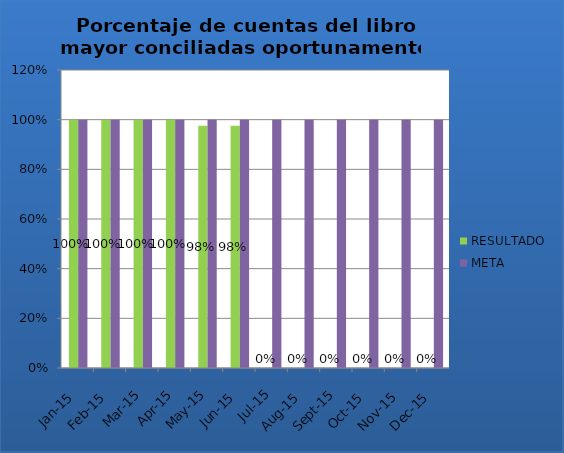
| Category | RESULTADO | META |
|---|---|---|
| ene-15 | 1 | 1 |
| feb-15 | 1 | 1 |
| mar-15 | 1 | 1 |
| abr-15 | 1 | 1 |
| may-15 | 0.976 | 1 |
| jun-15 | 0.976 | 1 |
| jul-15 | 0 | 1 |
| ago-15 | 0 | 1 |
| sep-15 | 0 | 1 |
| oct-15 | 0 | 1 |
| nov-15 | 0 | 1 |
| dic-15 | 0 | 1 |